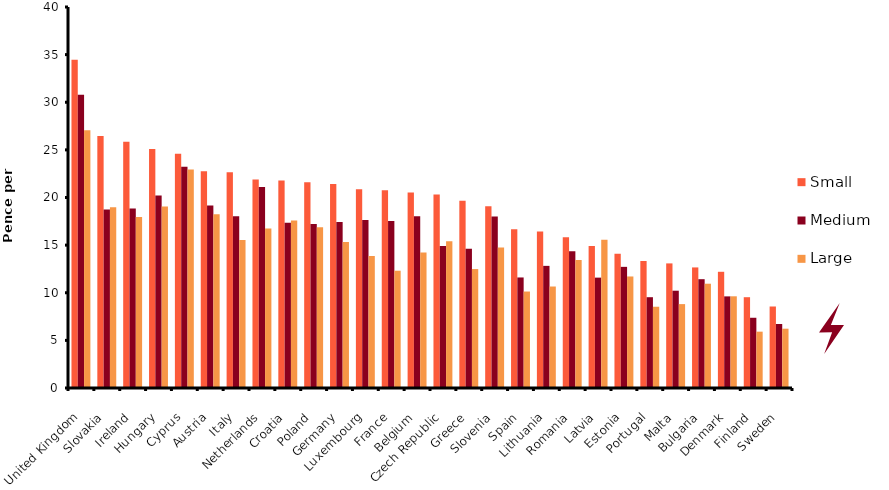
| Category | Small | Medium | Large |
|---|---|---|---|
| United Kingdom | 34.464 | 30.799 | 27.071 |
| Slovakia | 26.457 | 18.746 | 18.988 |
| Ireland | 25.852 | 18.85 | 17.943 |
| Hungary | 25.084 | 20.222 | 19.065 |
| Cyprus | 24.592 | 23.236 | 22.942 |
| Austria | 22.761 | 19.16 | 18.254 |
| Italy | 22.649 | 18.029 | 15.534 |
| Netherlands | 21.88 | 21.112 | 16.743 |
| Croatia | 21.777 | 17.356 | 17.58 |
| Poland | 21.595 | 17.226 | 16.864 |
| Germany | 21.414 | 17.416 | 15.335 |
| Luxembourg | 20.879 | 17.641 | 13.867 |
| France | 20.749 | 17.546 | 12.313 |
| Belgium | 20.525 | 18.029 | 14.23 |
| Czech Republic | 20.309 | 14.921 | 15.396 |
| Greece | 19.661 | 14.627 | 12.486 |
| Slovenia | 19.091 | 17.995 | 14.757 |
| Spain | 16.674 | 11.605 | 10.129 |
| Lithuania | 16.423 | 12.823 | 10.655 |
| Romania | 15.819 | 14.351 | 13.444 |
| Latvia | 14.912 | 11.588 | 15.56 |
| Estonia | 14.092 | 12.719 | 11.709 |
| Portugal | 13.332 | 9.533 | 8.531 |
| Malta | 13.082 | 10.215 | 8.807 |
| Bulgaria | 12.658 | 11.424 | 10.949 |
| Denmark | 12.201 | 9.619 | 9.628 |
| Finland | 9.533 | 7.374 | 5.915 |
| Sweden | 8.557 | 6.718 | 6.226 |